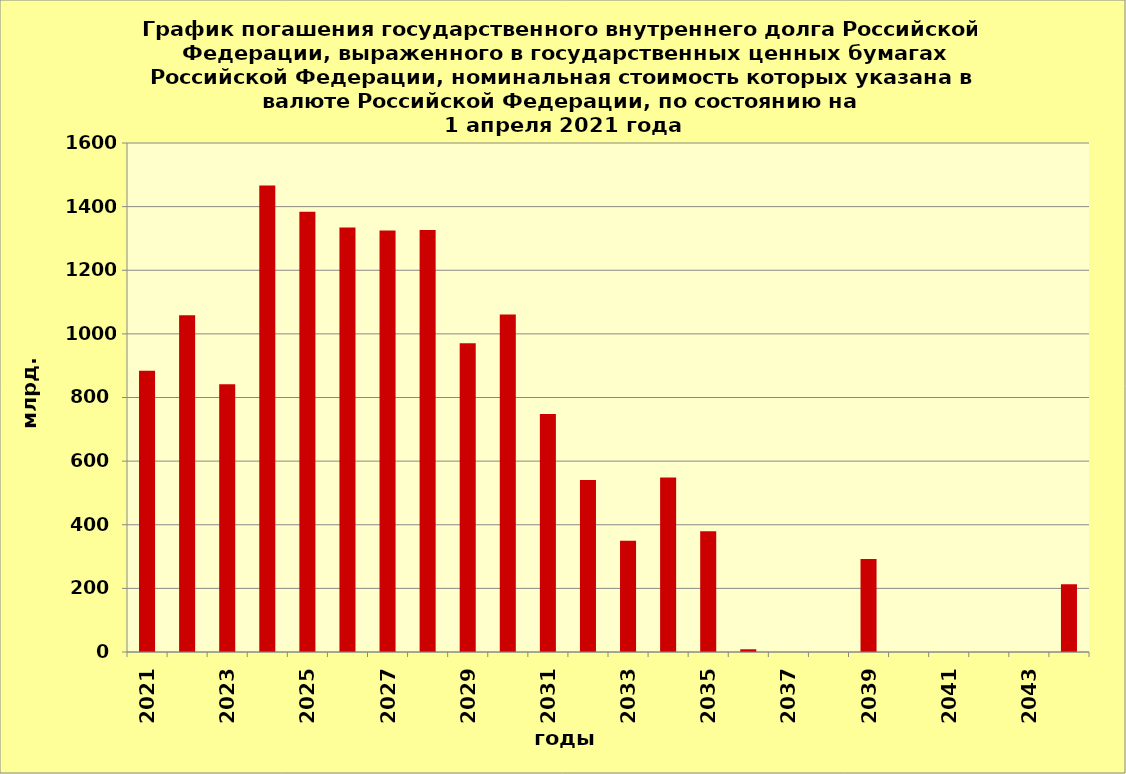
| Category | ряд 1 |
|---|---|
| 2021.0 | 884.123 |
| 2022.0 | 1058.394 |
| 2023.0 | 841.51 |
| 2024.0 | 1466.25 |
| 2025.0 | 1383.952 |
| 2026.0 | 1334.561 |
| 2027.0 | 1324.833 |
| 2028.0 | 1326.607 |
| 2029.0 | 970.488 |
| 2030.0 | 1060.634 |
| 2031.0 | 748.163 |
| 2032.0 | 540.894 |
| 2033.0 | 350 |
| 2034.0 | 548.84 |
| 2035.0 | 379.704 |
| 2036.0 | 8.553 |
| 2037.0 | 0 |
| 2038.0 | 0 |
| 2039.0 | 292.181 |
| 2040.0 | 0 |
| 2041.0 | 0 |
| 2042.0 | 0 |
| 2043.0 | 0 |
| 2044.0 | 212.636 |